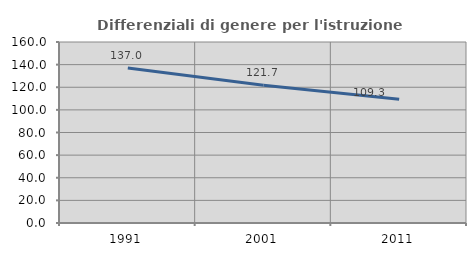
| Category | Differenziali di genere per l'istruzione superiore |
|---|---|
| 1991.0 | 136.965 |
| 2001.0 | 121.734 |
| 2011.0 | 109.313 |